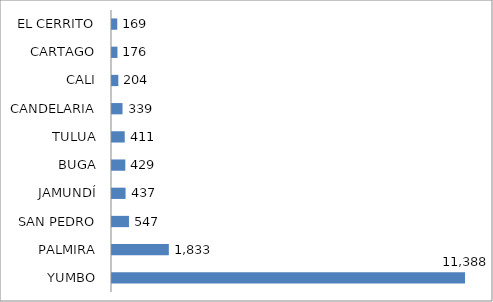
| Category | Series 0 |
|---|---|
| YUMBO | 11388.355 |
| PALMIRA | 1833.428 |
| SAN PEDRO | 547.498 |
| JAMUNDÍ | 437.139 |
| BUGA | 429.232 |
| TULUA | 410.596 |
| CANDELARIA | 339.272 |
| CALI | 204.029 |
| CARTAGO | 175.902 |
| EL CERRITO | 169.212 |